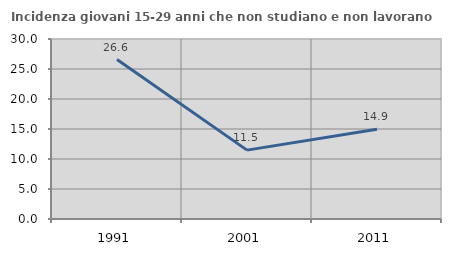
| Category | Incidenza giovani 15-29 anni che non studiano e non lavorano  |
|---|---|
| 1991.0 | 26.58 |
| 2001.0 | 11.478 |
| 2011.0 | 14.941 |